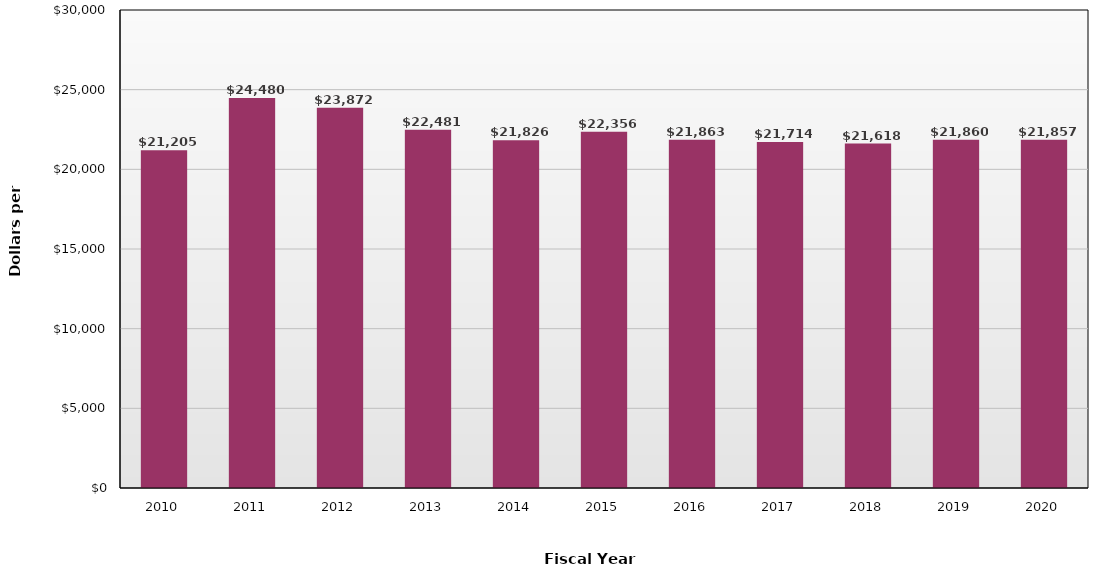
| Category | Dollars per FTE |
|---|---|
| 2010.0 | 21205 |
| 2011.0 | 24480 |
| 2012.0 | 23872 |
| 2013.0 | 22481 |
| 2014.0 | 21826 |
| 2015.0 | 22356 |
| 2016.0 | 21863 |
| 2017.0 | 21714 |
| 2018.0 | 21618 |
| 2019.0 | 21860 |
| 2020.0 | 21857 |